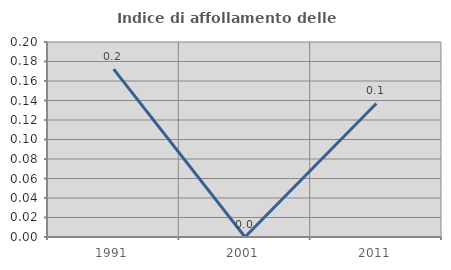
| Category | Indice di affollamento delle abitazioni  |
|---|---|
| 1991.0 | 0.172 |
| 2001.0 | 0 |
| 2011.0 | 0.137 |